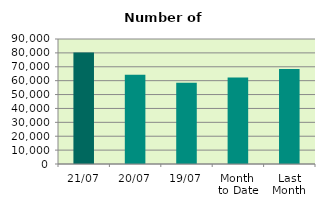
| Category | Series 0 |
|---|---|
| 21/07 | 80200 |
| 20/07 | 64236 |
| 19/07 | 58498 |
| Month 
to Date | 62328.8 |
| Last
Month | 68392.182 |